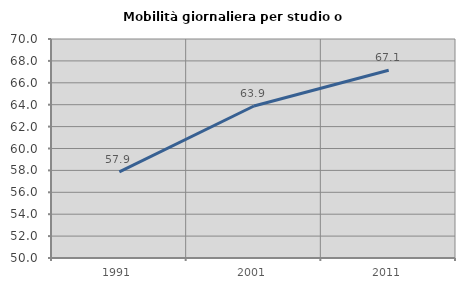
| Category | Mobilità giornaliera per studio o lavoro |
|---|---|
| 1991.0 | 57.862 |
| 2001.0 | 63.882 |
| 2011.0 | 67.143 |